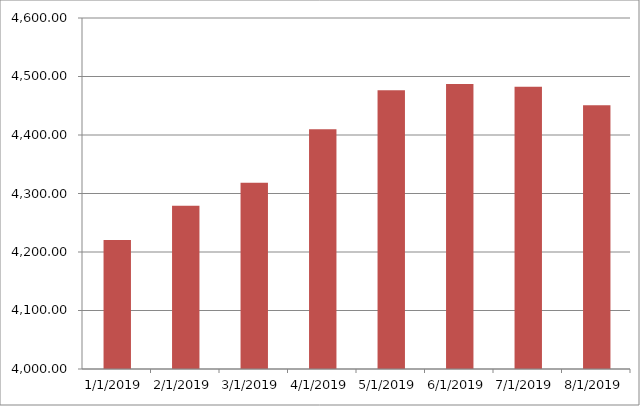
| Category | Series 0 | Series 1 |
|---|---|---|
| 1/1/19 |  | 4220.44 |
| 2/1/19 |  | 4278.86 |
| 3/1/19 |  | 4318.42 |
| 4/1/19 |  | 4410.04 |
| 5/1/19 |  | 4476.6 |
| 6/1/19 |  | 4486.97 |
| 7/1/19 |  | 4482.57 |
| 8/1/19 |  | 4450.86 |